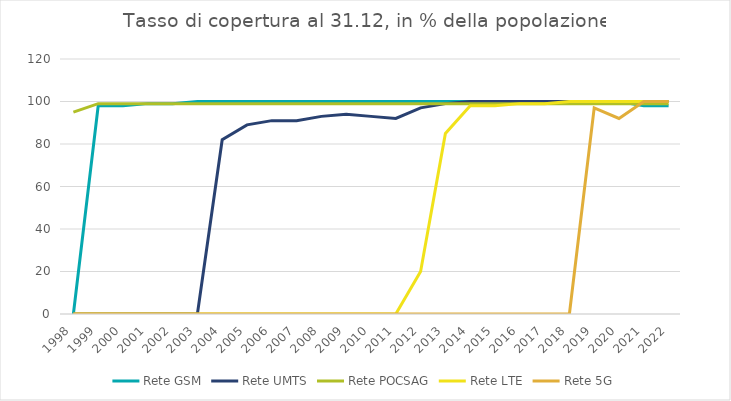
| Category | Rete GSM | Rete UMTS | Rete POCSAG | Rete LTE | Rete 5G |
|---|---|---|---|---|---|
| 1998.0 | 0 | 0 | 95 | 0 | 0 |
| 1999.0 | 98 | 0 | 99 | 0 | 0 |
| 2000.0 | 98 | 0 | 99 | 0 | 0 |
| 2001.0 | 99 | 0 | 99 | 0 | 0 |
| 2002.0 | 99 | 0 | 99 | 0 | 0 |
| 2003.0 | 100 | 0 | 99 | 0 | 0 |
| 2004.0 | 100 | 82 | 99 | 0 | 0 |
| 2005.0 | 100 | 89 | 99 | 0 | 0 |
| 2006.0 | 100 | 91 | 99 | 0 | 0 |
| 2007.0 | 100 | 91 | 99 | 0 | 0 |
| 2008.0 | 100 | 93 | 99 | 0 | 0 |
| 2009.0 | 100 | 94 | 99 | 0 | 0 |
| 2010.0 | 100 | 93 | 99 | 0 | 0 |
| 2011.0 | 100 | 92 | 99 | 0 | 0 |
| 2012.0 | 100 | 97 | 99 | 20 | 0 |
| 2013.0 | 100 | 99 | 99 | 85 | 0 |
| 2014.0 | 100 | 100 | 99 | 98 | 0 |
| 2015.0 | 100 | 100 | 99 | 98 | 0 |
| 2016.0 | 100 | 100 | 99 | 99 | 0 |
| 2017.0 | 100 | 100 | 99 | 99 | 0 |
| 2018.0 | 100 | 100 | 99 | 100 | 0 |
| 2019.0 | 100 | 100 | 99 | 100 | 97 |
| 2020.0 | 100 | 100 | 99 | 100 | 92 |
| 2021.0 | 98 | 100 | 99 | 100 | 100 |
| 2022.0 | 98 | 100 | 99 | 100 | 100 |